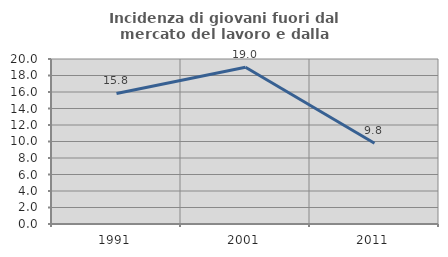
| Category | Incidenza di giovani fuori dal mercato del lavoro e dalla formazione  |
|---|---|
| 1991.0 | 15.827 |
| 2001.0 | 19 |
| 2011.0 | 9.783 |